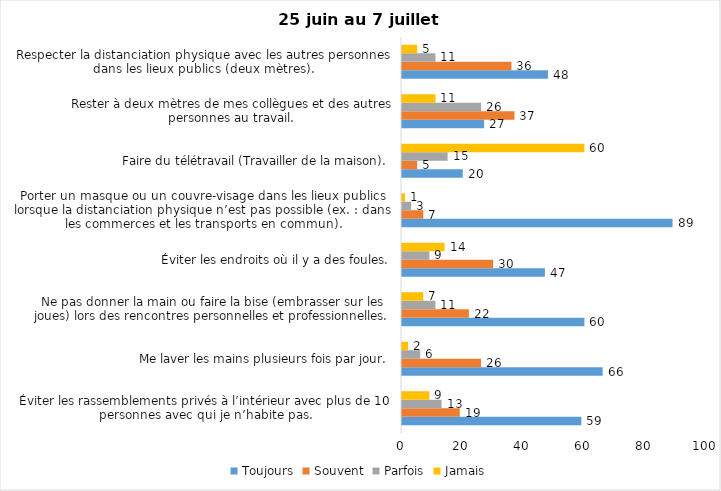
| Category | Toujours | Souvent | Parfois | Jamais |
|---|---|---|---|---|
| Éviter les rassemblements privés à l’intérieur avec plus de 10 personnes avec qui je n’habite pas. | 59 | 19 | 13 | 9 |
| Me laver les mains plusieurs fois par jour. | 66 | 26 | 6 | 2 |
| Ne pas donner la main ou faire la bise (embrasser sur les joues) lors des rencontres personnelles et professionnelles. | 60 | 22 | 11 | 7 |
| Éviter les endroits où il y a des foules. | 47 | 30 | 9 | 14 |
| Porter un masque ou un couvre-visage dans les lieux publics lorsque la distanciation physique n’est pas possible (ex. : dans les commerces et les transports en commun). | 89 | 7 | 3 | 1 |
| Faire du télétravail (Travailler de la maison). | 20 | 5 | 15 | 60 |
| Rester à deux mètres de mes collègues et des autres personnes au travail. | 27 | 37 | 26 | 11 |
| Respecter la distanciation physique avec les autres personnes dans les lieux publics (deux mètres). | 48 | 36 | 11 | 5 |